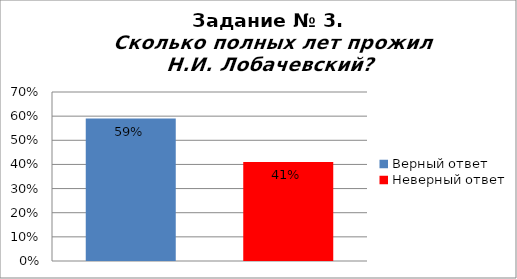
| Category | Сколько полных лет прожил Н.И. Лобачевский? |
|---|---|
| Верный ответ | 0.59 |
| Неверный ответ | 0.41 |